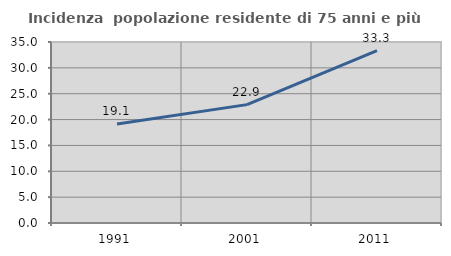
| Category | Incidenza  popolazione residente di 75 anni e più |
|---|---|
| 1991.0 | 19.139 |
| 2001.0 | 22.892 |
| 2011.0 | 33.333 |